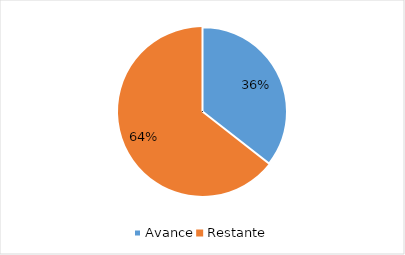
| Category | Series 0 |
|---|---|
| Avance | 0.355 |
| Restante | 0.645 |